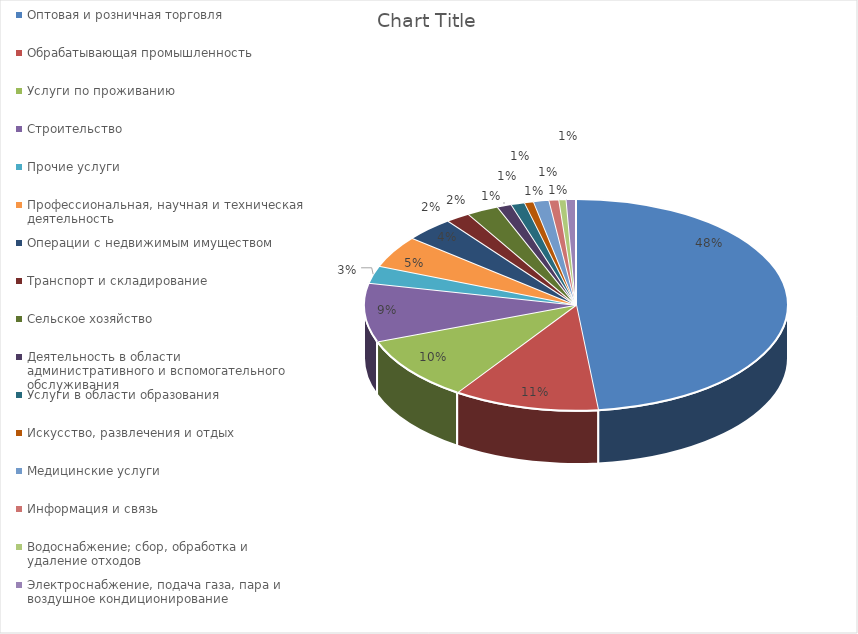
| Category | Series 0 |
|---|---|
| Оптовая и розничная торговля | 0.483 |
| Обрабатывающая промышленность | 0.111 |
| Услуги по проживанию | 0.099 |
| Строительство | 0.09 |
| Прочие услуги | 0.027 |
| Профессиональная, научная и техническая деятельность | 0.049 |
| Операции с недвижимым имуществом | 0.038 |
| Транспорт и складирование | 0.018 |
| Сельское хозяйство | 0.024 |
| Деятельность в области административного и вспомогательного обслуживания | 0.011 |
| Услуги в области образования | 0.01 |
| Искусство, развлечения и отдых | 0.007 |
| Медицинские услуги | 0.012 |
| Информация и связь | 0.008 |
| Водоснабжение; сбор, обработка и удаление отходов | 0.006 |
| Электроснабжение, подача газа, пара и воздушное кондиционирование | 0.007 |